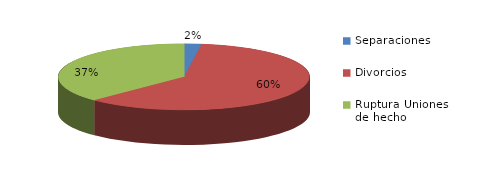
| Category | Series 0 |
|---|---|
| Separaciones | 67 |
| Divorcios | 1825 |
| Ruptura Uniones de hecho | 1133 |